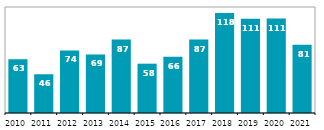
| Category |  mld. Kč |
|---|---|
| 2010 | 63.272 |
| 2011 | 45.697 |
| 2012 | 73.73 |
| 2013 | 68.997 |
| 2014 | 86.674 |
| 2015 | 58.16 |
| 2016 | 66.261 |
| 2017 | 86.543 |
| 2018 | 117.893 |
| 2019 | 111.03 |
| 2020 | 111.357 |
| 2021 | 80.54 |